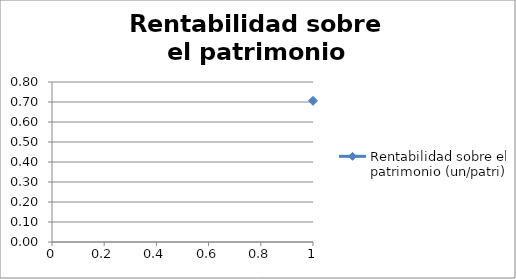
| Category | Rentabilidad sobre el patrimonio (un/patri) |
|---|---|
| 0 | 0.706 |
| 1 | 0.414 |
| 2 | 0.293 |
| 3 | 0.226 |
| 4 | 0.185 |
| 5 | 0.156 |
| 6 | 0.135 |
| 7 | 0.119 |